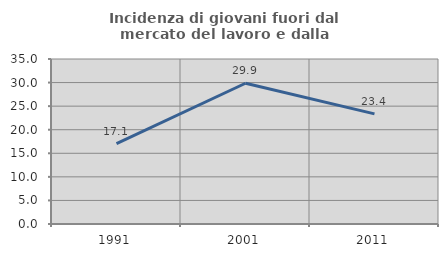
| Category | Incidenza di giovani fuori dal mercato del lavoro e dalla formazione  |
|---|---|
| 1991.0 | 17.058 |
| 2001.0 | 29.853 |
| 2011.0 | 23.361 |